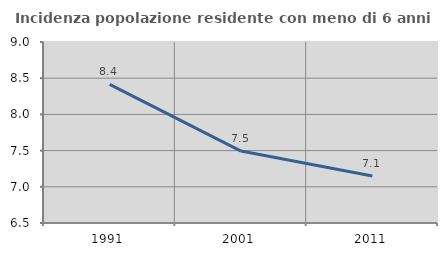
| Category | Incidenza popolazione residente con meno di 6 anni |
|---|---|
| 1991.0 | 8.415 |
| 2001.0 | 7.493 |
| 2011.0 | 7.149 |